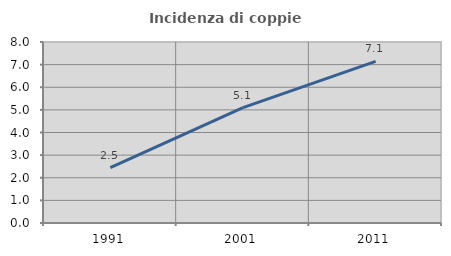
| Category | Incidenza di coppie miste |
|---|---|
| 1991.0 | 2.452 |
| 2001.0 | 5.102 |
| 2011.0 | 7.143 |